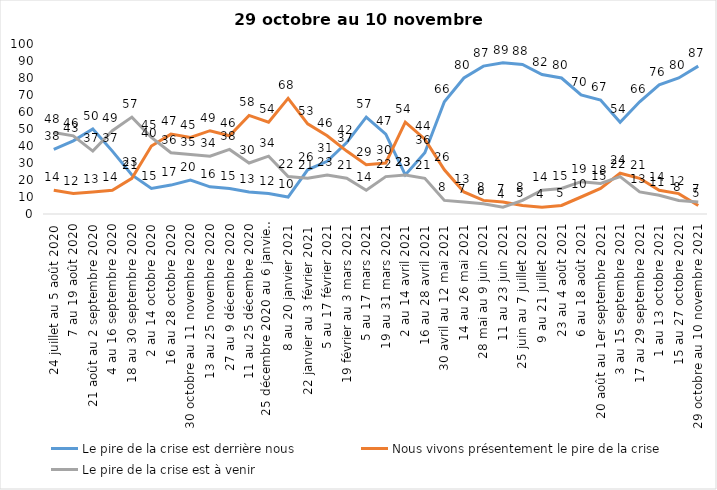
| Category | Le pire de la crise est derrière nous | Nous vivons présentement le pire de la crise | Le pire de la crise est à venir |
|---|---|---|---|
| 24 juillet au 5 août 2020 | 38 | 14 | 48 |
| 7 au 19 août 2020 | 43 | 12 | 46 |
| 21 août au 2 septembre 2020 | 50 | 13 | 37 |
| 4 au 16 septembre 2020 | 37 | 14 | 49 |
| 18 au 30 septembre 2020 | 23 | 21 | 57 |
| 2 au 14 octobre 2020 | 15 | 40 | 45 |
| 16 au 28 octobre 2020 | 17 | 47 | 36 |
| 30 octobre au 11 novembre 2020 | 20 | 45 | 35 |
| 13 au 25 novembre 2020 | 16 | 49 | 34 |
| 27 au 9 décembre 2020 | 15 | 46 | 38 |
| 11 au 25 décembre 2020 | 13 | 58 | 30 |
| 25 décembre 2020 au 6 janvier 2021 | 12 | 54 | 34 |
| 8 au 20 janvier 2021 | 10 | 68 | 22 |
| 22 janvier au 3 février 2021 | 26 | 53 | 21 |
| 5 au 17 février 2021 | 31 | 46 | 23 |
| 19 février au 3 mars 2021 | 42 | 37 | 21 |
| 5 au 17 mars 2021 | 57 | 29 | 14 |
| 19 au 31 mars 2021 | 47 | 30 | 22 |
| 2 au 14 avril 2021 | 23 | 54 | 23 |
| 16 au 28 avril 2021 | 36 | 44 | 21 |
| 30 avril au 12 mai 2021 | 66 | 26 | 8 |
| 14 au 26 mai 2021 | 80 | 13 | 7 |
| 28 mai au 9 juin 2021 | 87 | 8 | 6 |
| 11 au 23 juin 2021 | 89 | 7 | 4 |
| 25 juin au 7 juillet 2021 | 88 | 5 | 8 |
| 9 au 21 juillet 2021 | 82 | 4 | 14 |
| 23 au 4 août 2021 | 80 | 5 | 15 |
| 6 au 18 août 2021 | 70 | 10 | 19 |
| 20 août au 1er septembre 2021 | 67 | 15 | 18 |
| 3 au 15 septembre 2021 | 54 | 24 | 22 |
| 17 au 29 septembre 2021 | 66 | 21 | 13 |
| 1 au 13 octobre 2021 | 76 | 14 | 11 |
| 15 au 27 octobre 2021 | 80 | 12 | 8 |
| 29 octobre au 10 novembre 2021 | 87 | 5 | 7 |